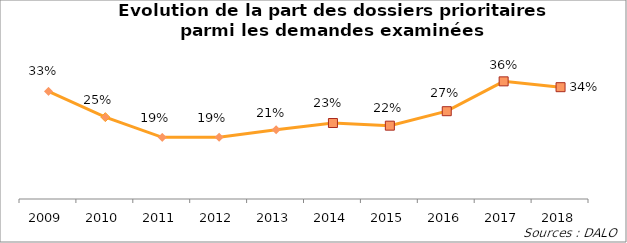
| Category | Series 1 |
|---|---|
| 2009.0 | 0.326 |
| 2010.0 | 0.248 |
| 2011.0 | 0.187 |
| 2012.0 | 0.187 |
| 2013.0 | 0.21 |
| 2014.0 | 0.23 |
| 2015.0 | 0.222 |
| 2016.0 | 0.266 |
| 2017.0 | 0.357 |
| 2018.0 | 0.339 |